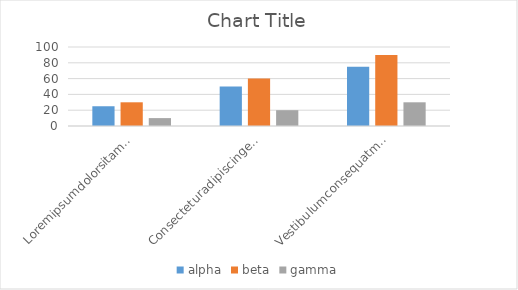
| Category | alpha | beta | gamma |
|---|---|---|---|
| Loremipsumdolorsitamet | 25 | 30 | 10 |
| Consecteturadipiscingelit | 50 | 60 | 20 |
| Vestibulumconsequatmiquispretiumsemper | 75 | 90 | 30 |